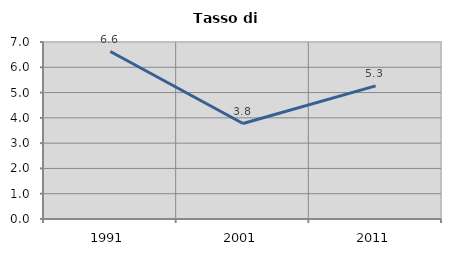
| Category | Tasso di disoccupazione   |
|---|---|
| 1991.0 | 6.624 |
| 2001.0 | 3.777 |
| 2011.0 | 5.263 |